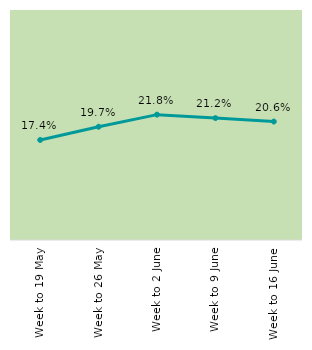
| Category | Series 0 |
|---|---|
| Week to 19 May | 0.174 |
| Week to 26 May | 0.197 |
| Week to 2 June | 0.218 |
| Week to 9 June | 0.212 |
| Week to 16 June | 0.206 |